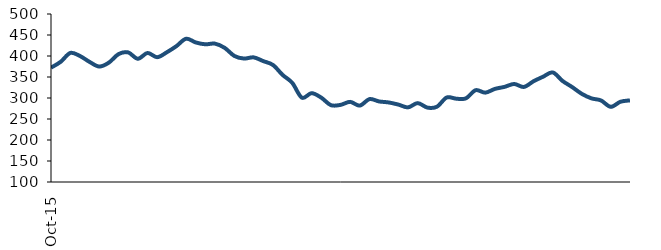
| Category | Series 0 |
|---|---|
| 2015-10-01 | 372.232 |
| 2015-11-01 | 386.097 |
| 2015-12-01 | 407.237 |
| 2016-01-01 | 399.986 |
| 2016-02-01 | 385.887 |
| 2016-03-01 | 374.901 |
| 2016-04-01 | 384.272 |
| 2016-05-01 | 404.514 |
| 2016-06-01 | 408.533 |
| 2016-07-01 | 393.406 |
| 2016-08-01 | 407.207 |
| 2016-09-01 | 397.159 |
| 2016-10-01 | 408.873 |
| 2016-11-01 | 423.594 |
| 2016-12-01 | 441.096 |
| 2017-01-01 | 432.24 |
| 2017-02-01 | 427.881 |
| 2017-03-01 | 429.391 |
| 2017-04-01 | 419.316 |
| 2017-05-01 | 400.16 |
| 2017-06-01 | 393.909 |
| 2017-07-01 | 396.711 |
| 2017-08-01 | 387.782 |
| 2017-09-01 | 378.634 |
| 2017-10-01 | 354.935 |
| 2017-11-01 | 336.063 |
| 2017-12-01 | 300.729 |
| 2018-01-01 | 311.502 |
| 2018-02-01 | 300.938 |
| 2018-03-01 | 283.016 |
| 2018-04-01 | 283.614 |
| 2018-05-01 | 290.801 |
| 2018-06-01 | 281.883 |
| 2018-07-01 | 297.363 |
| 2018-08-01 | 291.807 |
| 2018-09-01 | 289.382 |
| 2018-10-01 | 284.275 |
| 2018-11-01 | 277.69 |
| 2018-12-01 | 287.83 |
| 2019-01-01 | 277.205 |
| 2019-02-01 | 279.29 |
| 2019-03-01 | 301.162 |
| 2019-04-01 | 298.325 |
| 2019-05-01 | 299.2 |
| 2019-06-01 | 318.549 |
| 2019-07-01 | 312.749 |
| 2019-08-01 | 321.636 |
| 2019-09-01 | 326.515 |
| 2019-10-01 | 333.383 |
| 2019-11-01 | 326.295 |
| 2019-12-01 | 339.824 |
| 2020-01-01 | 350.768 |
| 2020-02-01 | 360.883 |
| 2020-03-01 | 340.754 |
| 2020-04-01 | 326.108 |
| 2020-05-01 | 309.949 |
| 2020-06-01 | 299.181 |
| 2020-07-01 | 294.112 |
| 2020-08-01 | 278.992 |
| 2020-09-01 | 290.987 |
| 2020-10-01 | 294.359 |